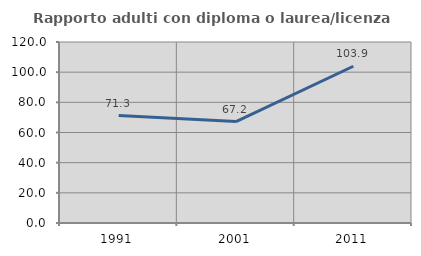
| Category | Rapporto adulti con diploma o laurea/licenza media  |
|---|---|
| 1991.0 | 71.264 |
| 2001.0 | 67.221 |
| 2011.0 | 103.931 |